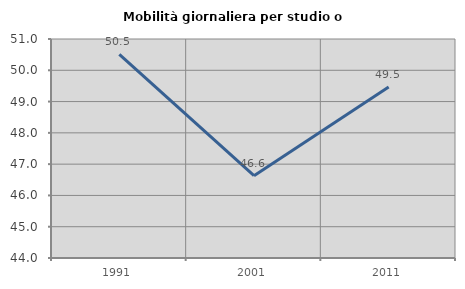
| Category | Mobilità giornaliera per studio o lavoro |
|---|---|
| 1991.0 | 50.507 |
| 2001.0 | 46.63 |
| 2011.0 | 49.462 |